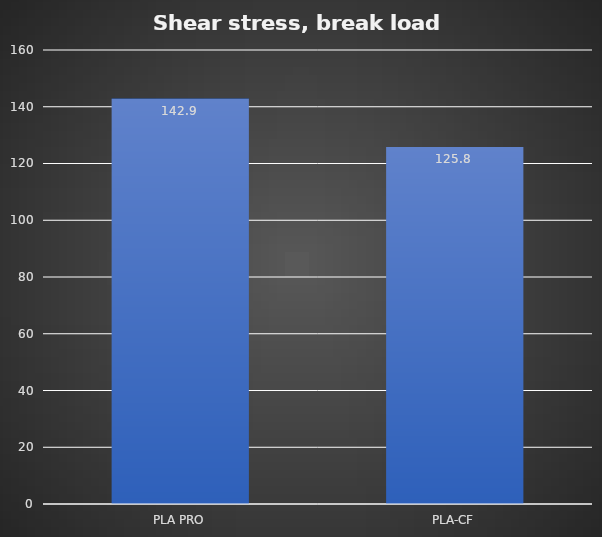
| Category | Break kg |
|---|---|
| PLA PRO | 142.9 |
| PLA-CF | 125.8 |